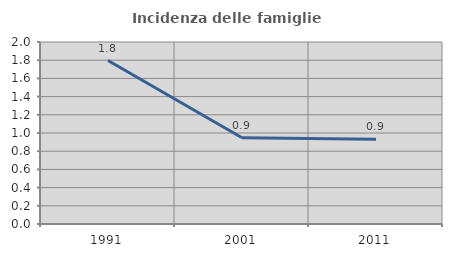
| Category | Incidenza delle famiglie numerose |
|---|---|
| 1991.0 | 1.796 |
| 2001.0 | 0.947 |
| 2011.0 | 0.931 |